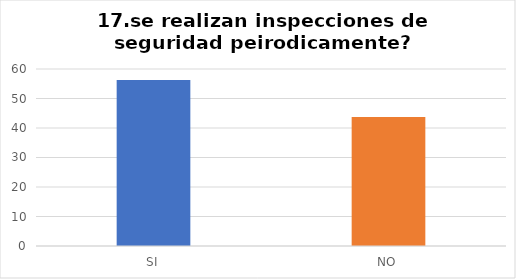
| Category | se realizan inspecciones de seguridad peirodicamente? |
|---|---|
| SI | 56.25 |
| NO | 43.75 |